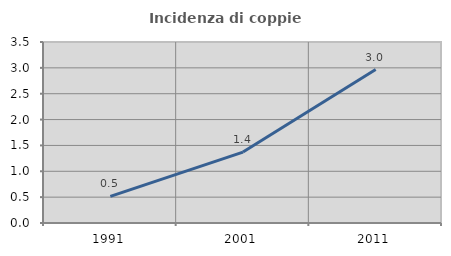
| Category | Incidenza di coppie miste |
|---|---|
| 1991.0 | 0.515 |
| 2001.0 | 1.371 |
| 2011.0 | 2.967 |